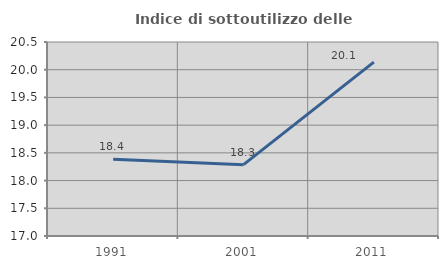
| Category | Indice di sottoutilizzo delle abitazioni  |
|---|---|
| 1991.0 | 18.386 |
| 2001.0 | 18.287 |
| 2011.0 | 20.136 |